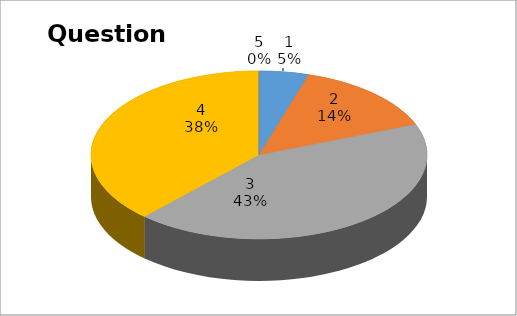
| Category | Series 0 |
|---|---|
| 0 | 1 |
| 1 | 3 |
| 2 | 9 |
| 3 | 8 |
| 4 | 0 |